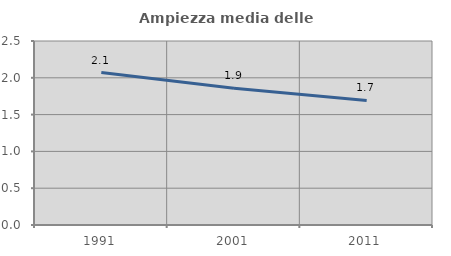
| Category | Ampiezza media delle famiglie |
|---|---|
| 1991.0 | 2.072 |
| 2001.0 | 1.859 |
| 2011.0 | 1.693 |